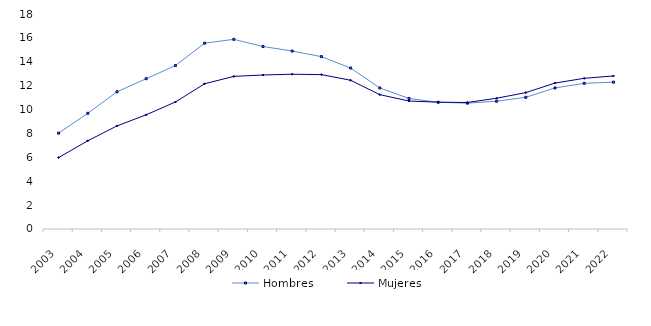
| Category | Hombres | Mujeres |
|---|---|---|
| 2003 | 8.026 | 5.978 |
| 2004 | 9.686 | 7.387 |
| 2005 | 11.488 | 8.63 |
| 2006 | 12.583 | 9.56 |
| 2007 | 13.683 | 10.633 |
| 2008 | 15.558 | 12.159 |
| 2009 | 15.879 | 12.779 |
| 2010 | 15.279 | 12.892 |
| 2011 | 14.897 | 12.959 |
| 2012 | 14.432 | 12.923 |
| 2013 | 13.475 | 12.454 |
| 2014 | 11.809 | 11.247 |
| 2015 | 10.924 | 10.714 |
| 2016 | 10.611 | 10.617 |
| 2017 | 10.536 | 10.592 |
| 2018 | 10.699 | 10.946 |
| 2019 | 11.025 | 11.421 |
| 2020 | 11.811 | 12.218 |
| 2021 | 12.198 | 12.616 |
| 2022 | 12.296 | 12.813 |